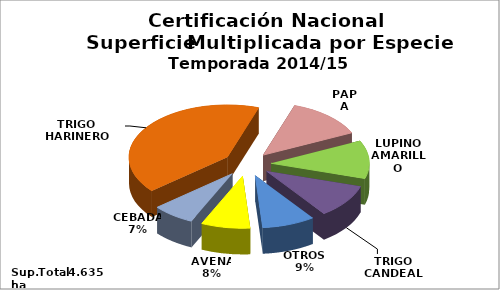
| Category | Series 0 |
|---|---|
| TRIGO HARINERO | 1914 |
| PAPA | 592.7 |
| LUPINO AMARILLO | 544 |
| TRIGO CANDEAL | 480 |
| OTROS | 404 |
| AVENA | 374 |
| CEBADA | 326 |